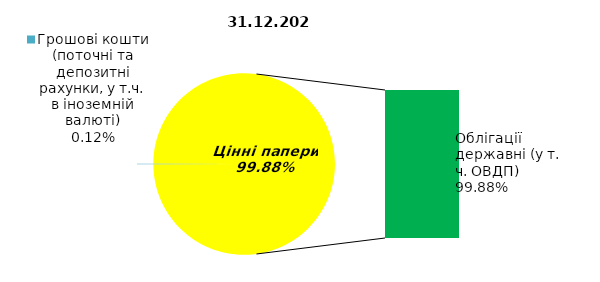
| Category | Series 0 |
|---|---|
| Грошові кошти (поточні та депозитні рахунки, у т.ч. в іноземній валюті) | 0.208 |
| Банківські метали | 0 |
| Нерухомість | 0 |
| Інші активи | 0 |
| Акції | 0 |
| Облігації підприємств | 0 |
| Муніципальні облігації | 0 |
| Облігації державні (у т. ч. ОВДП) | 170.477 |
| Іпотечні сертифікати | 0 |